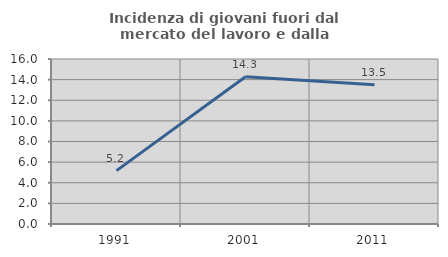
| Category | Incidenza di giovani fuori dal mercato del lavoro e dalla formazione  |
|---|---|
| 1991.0 | 5.172 |
| 2001.0 | 14.286 |
| 2011.0 | 13.514 |